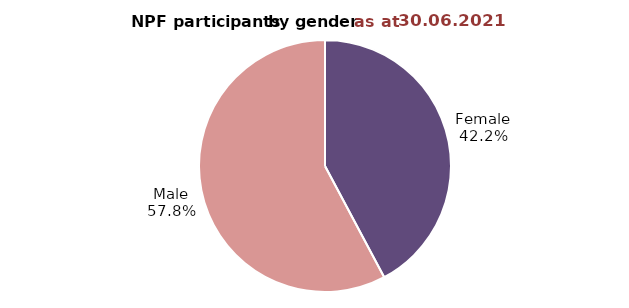
| Category | Series 0 |
|---|---|
| Female | 369611 |
| Male | 505990 |